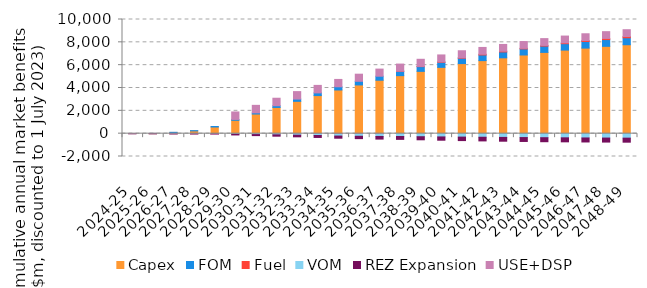
| Category | Capex | FOM | Fuel | VOM | REZ Expansion | USE+DSP |
|---|---|---|---|---|---|---|
| 2024-25 | 0 | 0 | 1.966 | -1.445 | 0.052 | 0 |
| 2025-26 | 15.722 | 1.666 | -16.777 | -1.495 | 1.131 | -0.363 |
| 2026-27 | 106.822 | 10.355 | -9.772 | -2.225 | -1.446 | -0.591 |
| 2027-28 | 244.864 | 17.845 | -9.381 | -3.014 | -12.763 | -2.255 |
| 2028-29 | 585.795 | 44.573 | -11.259 | -20.28 | -26.612 | -0.612 |
| 2029-30 | 1171.436 | 74.864 | -5.241 | -47.432 | -59.22 | 655.873 |
| 2030-31 | 1720.633 | 103.392 | -5.796 | -74.667 | -89.654 | 655.873 |
| 2031-32 | 2296.779 | 150.848 | -7.161 | -95.094 | -118.181 | 655.873 |
| 2032-33 | 2832.862 | 194.964 | -11.008 | -120.797 | -144.767 | 655.863 |
| 2033-34 | 3335.903 | 236.59 | -15.033 | -147.785 | -168.917 | 655.789 |
| 2034-35 | 3826.378 | 281.243 | -34.552 | -174.552 | -188.812 | 643.162 |
| 2035-36 | 4268.773 | 317.434 | -26.013 | -201.214 | -207.516 | 623.519 |
| 2036-37 | 4681.058 | 351.163 | -18.101 | -225.896 | -231.194 | 623.518 |
| 2037-38 | 5082.059 | 384.644 | 5.573 | -248.689 | -250.738 | 623.087 |
| 2038-39 | 5456.826 | 415.936 | 18.775 | -266.936 | -269.324 | 623.027 |
| 2039-40 | 5808.002 | 445.257 | 24.393 | -285.562 | -287.595 | 618.716 |
| 2040-41 | 6138.391 | 473.215 | 32.183 | -301.391 | -304.42 | 618.827 |
| 2041-42 | 6398.682 | 494.643 | 60.364 | -314.273 | -319.443 | 599.151 |
| 2042-43 | 6644.733 | 513.478 | 62.533 | -328.02 | -332.672 | 594.127 |
| 2043-44 | 6891.485 | 533.241 | 48.842 | -341.366 | -341.499 | 595.242 |
| 2044-45 | 7119.052 | 551.317 | 59.399 | -353.44 | -351.511 | 595.39 |
| 2045-46 | 7318.365 | 563.066 | 68.796 | -364.478 | -350.762 | 599.13 |
| 2046-47 | 7495.148 | 576.721 | 85.174 | -375.927 | -351.267 | 593.017 |
| 2047-48 | 7649.406 | 594.256 | 96.901 | -384.743 | -351.743 | 594.8 |
| 2048-49 | 7789.539 | 610.226 | 111.563 | -392.715 | -353.088 | 594.532 |